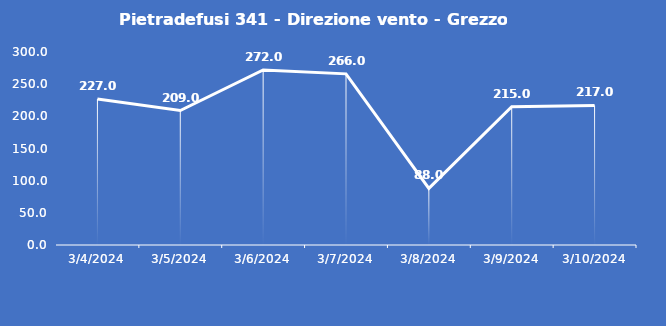
| Category | Pietradefusi 341 - Direzione vento - Grezzo (°N) |
|---|---|
| 3/4/24 | 227 |
| 3/5/24 | 209 |
| 3/6/24 | 272 |
| 3/7/24 | 266 |
| 3/8/24 | 88 |
| 3/9/24 | 215 |
| 3/10/24 | 217 |